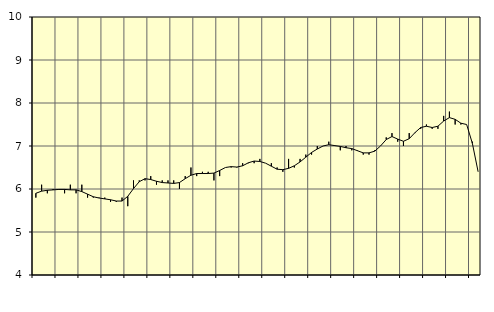
| Category | Piggar | Personliga och kulturella tjänster, SNI 90-98 |
|---|---|---|
| nan | 5.8 | 5.9 |
| 1.0 | 6.1 | 5.95 |
| 1.0 | 5.9 | 5.97 |
| 1.0 | 6 | 5.98 |
| nan | 6 | 5.99 |
| 2.0 | 5.9 | 5.99 |
| 2.0 | 6.1 | 5.98 |
| 2.0 | 5.9 | 5.98 |
| nan | 6.1 | 5.94 |
| 3.0 | 5.8 | 5.88 |
| 3.0 | 5.8 | 5.82 |
| 3.0 | 5.8 | 5.79 |
| nan | 5.8 | 5.77 |
| 4.0 | 5.7 | 5.75 |
| 4.0 | 5.7 | 5.72 |
| 4.0 | 5.8 | 5.72 |
| nan | 5.6 | 5.83 |
| 5.0 | 6.2 | 6.01 |
| 5.0 | 6.2 | 6.17 |
| 5.0 | 6.2 | 6.24 |
| nan | 6.3 | 6.22 |
| 6.0 | 6.1 | 6.18 |
| 6.0 | 6.2 | 6.15 |
| 6.0 | 6.2 | 6.14 |
| nan | 6.2 | 6.13 |
| 7.0 | 6 | 6.15 |
| 7.0 | 6.3 | 6.24 |
| 7.0 | 6.5 | 6.32 |
| nan | 6.3 | 6.36 |
| 8.0 | 6.4 | 6.36 |
| 8.0 | 6.4 | 6.36 |
| 8.0 | 6.2 | 6.37 |
| nan | 6.3 | 6.43 |
| 9.0 | 6.5 | 6.5 |
| 9.0 | 6.5 | 6.52 |
| 9.0 | 6.5 | 6.51 |
| nan | 6.6 | 6.54 |
| 10.0 | 6.6 | 6.61 |
| 10.0 | 6.6 | 6.65 |
| 10.0 | 6.7 | 6.64 |
| nan | 6.6 | 6.6 |
| 11.0 | 6.6 | 6.53 |
| 11.0 | 6.5 | 6.46 |
| 11.0 | 6.4 | 6.45 |
| nan | 6.7 | 6.48 |
| 12.0 | 6.5 | 6.54 |
| 12.0 | 6.7 | 6.63 |
| 12.0 | 6.8 | 6.74 |
| nan | 6.8 | 6.85 |
| 13.0 | 7 | 6.93 |
| 13.0 | 7 | 7 |
| 13.0 | 7.1 | 7.03 |
| nan | 7 | 7.01 |
| 14.0 | 6.9 | 6.99 |
| 14.0 | 7 | 6.96 |
| 14.0 | 6.9 | 6.94 |
| nan | 6.9 | 6.89 |
| 15.0 | 6.8 | 6.84 |
| 15.0 | 6.8 | 6.84 |
| 15.0 | 6.9 | 6.88 |
| nan | 7 | 7 |
| 16.0 | 7.2 | 7.15 |
| 16.0 | 7.3 | 7.22 |
| 16.0 | 7.1 | 7.16 |
| nan | 7 | 7.11 |
| 17.0 | 7.3 | 7.17 |
| 17.0 | 7.3 | 7.31 |
| 17.0 | 7.4 | 7.43 |
| nan | 7.5 | 7.46 |
| 18.0 | 7.4 | 7.43 |
| 18.0 | 7.4 | 7.46 |
| 18.0 | 7.7 | 7.58 |
| nan | 7.8 | 7.66 |
| 19.0 | 7.5 | 7.62 |
| 19.0 | 7.5 | 7.53 |
| 19.0 | 7.5 | 7.5 |
| nan | 7.1 | 7.06 |
| 20.0 | 6.4 | 6.4 |